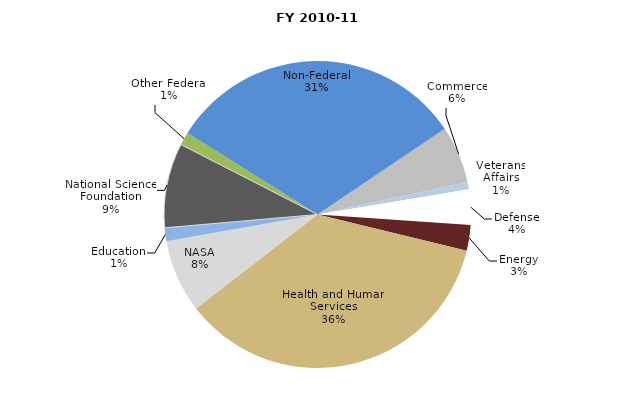
| Category | Series 0 |
|---|---|
| Commerce | 47976041 |
| Veterans Affairs | 6190332 |
| Defense | 29466980.65 |
| Energy | 21327441 |
| Health and Human Services | 283535597 |
| NASA | 61123457 |
| Education | 11074032 |
| National Science Foundation | 70715203 |
| Other Federal | 11009236 |
| Non-Federal | 251050074.05 |